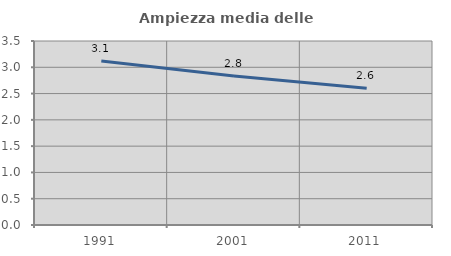
| Category | Ampiezza media delle famiglie |
|---|---|
| 1991.0 | 3.119 |
| 2001.0 | 2.835 |
| 2011.0 | 2.599 |